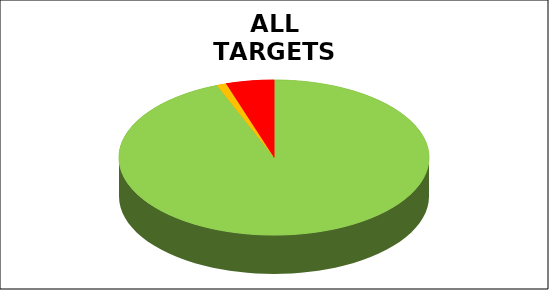
| Category | Series 0 |
|---|---|
| Green | 0.94 |
| Amber | 0.01 |
| Red | 0.05 |